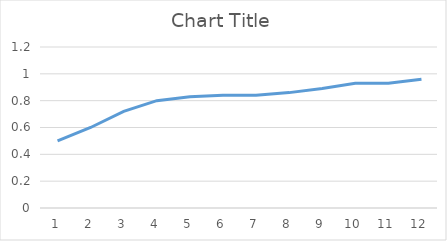
| Category | Series 0 |
|---|---|
| 0 | 0.5 |
| 1 | 0.6 |
| 2 | 0.72 |
| 3 | 0.8 |
| 4 | 0.83 |
| 5 | 0.84 |
| 6 | 0.84 |
| 7 | 0.86 |
| 8 | 0.89 |
| 9 | 0.93 |
| 10 | 0.93 |
| 11 | 0.96 |